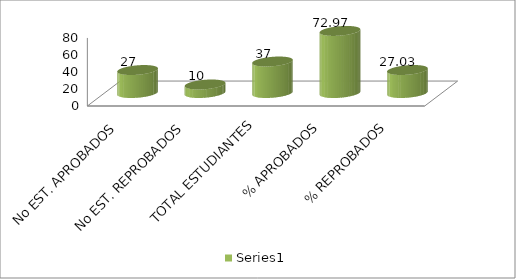
| Category | Series 0 |
|---|---|
| No EST. APROBADOS | 27 |
| No EST. REPROBADOS | 10 |
| TOTAL ESTUDIANTES | 37 |
| % APROBADOS | 72.973 |
| % REPROBADOS | 27.027 |